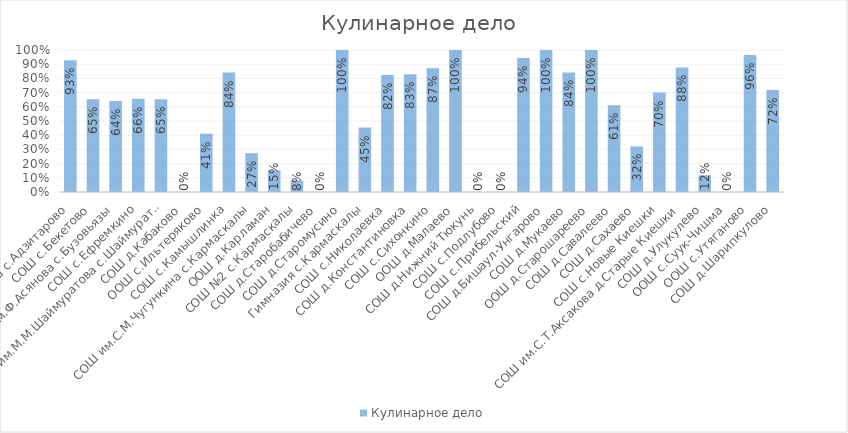
| Category | Кулинарное дело |
|---|---|
| СОШ с.Адзитарово | 0.929 |
| СОШ с.Бекетово | 0.652 |
| СОШ им.Ф.Асянова с.Бузовьязы | 0.64 |
| СОШ с.Ефремкино | 0.657 |
| СОШ им.М.М.Шаймуратова с.Шаймуратово | 0.653 |
| СОШ д.Кабаково | 0 |
| ООШ с.Ильтеряково | 0.411 |
| СОШ с.Камышлинка | 0.841 |
| СОШ им.С.М.Чугункина с.Кармаскалы | 0.274 |
| ООШ д.Карламан | 0.152 |
| СОШ №2 с.Кармаскалы | 0.082 |
| СОШ д.Старобабичево | 0 |
| СОШ д.Старомусино | 1 |
| Гимназия с.Кармаскалы | 0.454 |
| СОШ с.Николаевка | 0.824 |
| СОШ д.Константиновка | 0.829 |
| СОШ с.Сихонкино | 0.872 |
| ООШ д.Малаево | 1 |
| СОШ д.Нижний Тюкунь | 0 |
| СОШ с.Подлубово | 0 |
| СОШ с.Прибельский | 0.943 |
| СОШ д.Бишаул-Унгарово | 1 |
| СОШ д.Мукаево | 0.842 |
| ООШ д.Старошареево | 1 |
| СОШ д.Савалеево | 0.611 |
| СОШ д.Сахаево | 0.321 |
| СОШ с.Новые Киешки | 0.7 |
| СОШ им.С.Т.Аксакова д.Старые Киешки | 0.878 |
| СОШ д.Улукулево | 0.118 |
| ООШ с.Суук-Чишма | 0 |
| ООШ с.Утяганово | 0.964 |
| СОШ д.Шарипкулово | 0.718 |